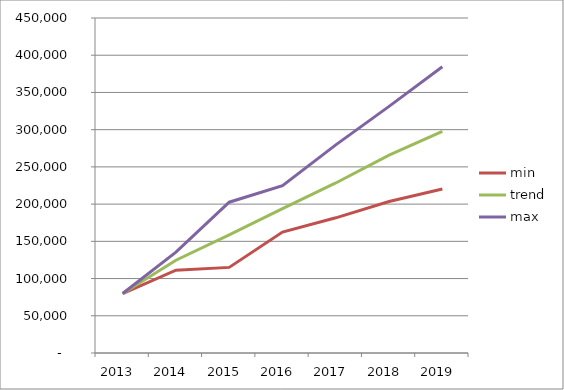
| Category |  min  |  trend  |  max  |
|---|---|---|---|
| 2013.0 | 79863.305 | 79863.305 | 79863.305 |
| 2014.0 | 111215.419 | 124600.082 | 135455.132 |
| 2015.0 | 115014.664 | 158705.375 | 202572.804 |
| 2016.0 | 162390.561 | 193869.071 | 224811.923 |
| 2017.0 | 181597.684 | 228409.194 | 279555.196 |
| 2018.0 | 203579.171 | 265688.3 | 331318.46 |
| 2019.0 | 220283.407 | 297624.939 | 384602.699 |